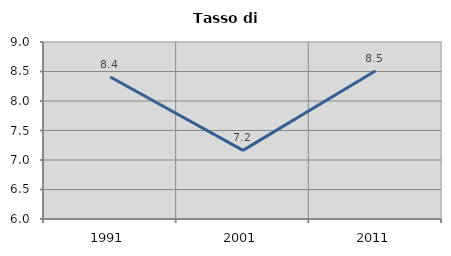
| Category | Tasso di disoccupazione   |
|---|---|
| 1991.0 | 8.408 |
| 2001.0 | 7.163 |
| 2011.0 | 8.514 |